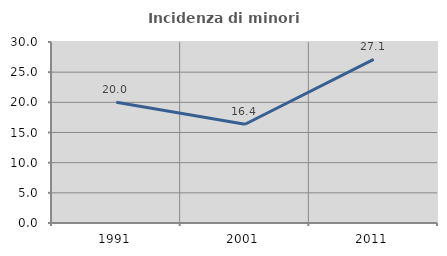
| Category | Incidenza di minori stranieri |
|---|---|
| 1991.0 | 20 |
| 2001.0 | 16.364 |
| 2011.0 | 27.132 |